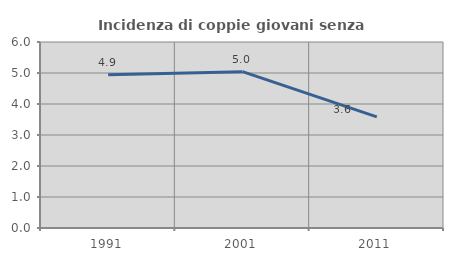
| Category | Incidenza di coppie giovani senza figli |
|---|---|
| 1991.0 | 4.947 |
| 2001.0 | 5.043 |
| 2011.0 | 3.583 |